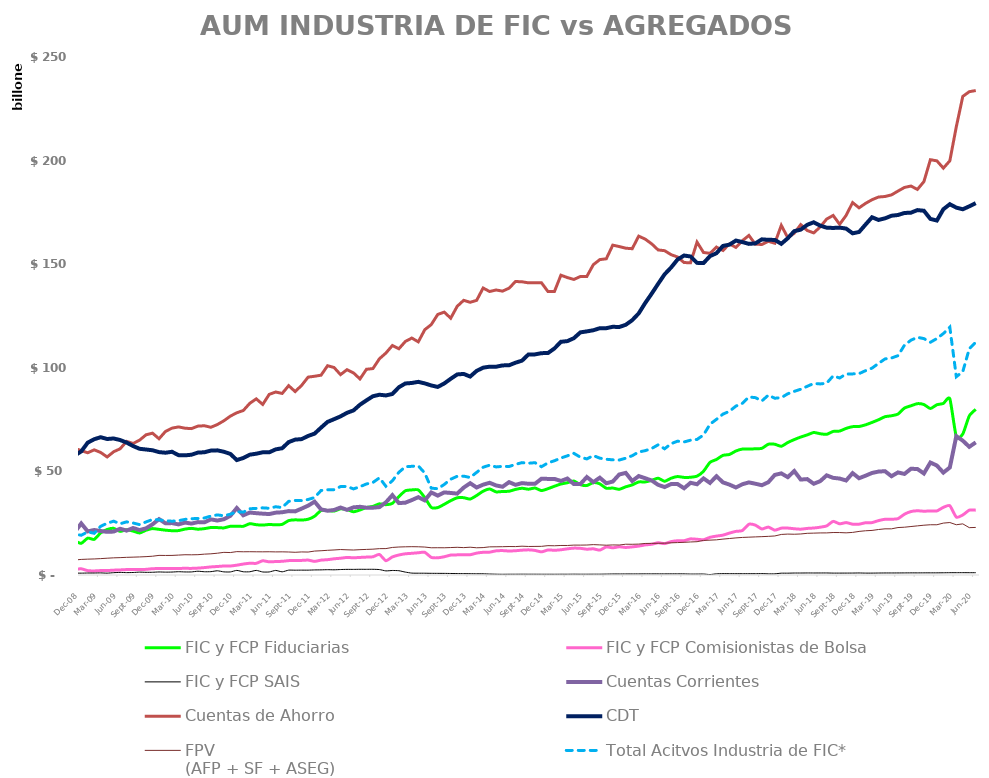
| Category | FIC y FCP Fiduciarias | FIC y FCP Comisionistas de Bolsa  | FIC y FCP SAIS | Cuentas Corrientes | Cuentas de Ahorro | CDT | FPV 
(AFP + SF + ASEG) | Total Acitvos Industria de FIC*  |
|---|---|---|---|---|---|---|---|---|
| 2008-01-01 | 12132808.79 | 2121832.26 | 544957.64 | 19249897.427 | 56056210.717 | 44941279.529 | 6945547.417 | 14799598.69 |
| 2008-02-01 | 12289879.65 | 2209666.7 | 519406.62 | 19213144.763 | 58419307.534 | 46482106.381 | 6986252.995 | 15018952.97 |
| 2008-03-01 | 12539377.12 | 2365642.48 | 580026.4 | 19370655.062 | 58209076.429 | 46770117.743 | 7003508.339 | 15485046 |
| 2008-04-01 | 12741364.47 | 2282972.94 | 561624.36 | 19492288.329 | 56874678.086 | 50148441.992 | 7150454.725 | 15585961.77 |
| 2008-05-01 | 12829643.03 | 2496281.61 | 662058.6 | 18663722.507 | 55639744.889 | 50761825.818 | 7208344.175 | 15987983.24 |
| 2008-06-01 | 12830951.12 | 2449742.03 | 701874.68 | 20003271.69 | 54847359.853 | 52034374.991 | 7166940.12 | 15982567.83 |
| 2008-07-01 | 13541278.95 | 2558464.4 | 754965.98 | 20342547.222 | 55678115.649 | 53125364.529 | 7175159.671 | 16854709.33 |
| 2008-08-01 | 13772968.36 | 2624403.07 | 815049.75 | 19770767.165 | 56148266.184 | 55348186.864 | 7294900.84 | 17212421.18 |
| 2008-09-01 | 13734669.578 | 2310280.49 | 544732.35 | 19250250.046 | 56145402.999 | 57015473.451 | 7349973.229 | 16589682.418 |
| 2008-10-01 | 13953414.868 | 2633334.91 | 921341.15 | 19804369.956 | 58986747.367 | 57700276.163 | 7188191.891 | 17508090.928 |
| 2008-11-01 | 16163521.832 | 2705717.241 | 932219.524 | 20735409.062 | 61155619.251 | 57692228.019 | 7246974.689 | 19801458.597 |
| 2008-12-01 | 15284899.058 | 2999156.471 | 891716.476 | 24887321.444 | 60019672.799 | 59648963.504 | 7516031.999 | 19175772.005 |
| 2009-01-01 | 17792239.172 | 2100542.66 | 962439.26 | 21040089.438 | 58999367.687 | 63877394.025 | 7647629.694 | 20855221.092 |
| 2009-02-01 | 17194217.152 | 1967140.68 | 956293.14 | 21714869.41 | 60405778.82 | 65534380.712 | 7751657.459 | 20117650.972 |
| 2009-03-01 | 20337363.88 | 2134644.38 | 1012448.54 | 21229406.812 | 59137277.4 | 66499801.412 | 7903642.968 | 23484456.8 |
| 2009-04-01 | 21958761.164 | 2138631.81 | 896627.12 | 20817553.96 | 56964966.372 | 65635299.329 | 8099376.93 | 24994020.094 |
| 2009-05-01 | 22513996.419 | 2336055.3 | 1121578.42 | 20961604.211 | 59492776.482 | 65895170.219 | 8286121.084 | 25971630.139 |
| 2009-06-01 | 21046486.068 | 2448437.58 | 1248642.13 | 22321940.134 | 60913043.271 | 65133059.461 | 8385600.015 | 24743565.778 |
| 2009-07-01 | 21871781.17 | 2623440.68 | 1149701.35 | 21420752.429 | 64486469.469 | 63910383.949 | 8522248.082 | 25644923.2 |
| 2009-08-01 | 21188789.878 | 2709594.68 | 1206713.71 | 22688223.969 | 63475807.938 | 62251898.303 | 8613906.771 | 25105098.268 |
| 2009-09-01 | 20280820.943 | 2658291.05 | 1386121.35 | 21673686.686 | 65073515.135 | 60908624.489 | 8719243.902 | 24325233.343 |
| 2009-10-01 | 21608487.093 | 2725247.27 | 1290257.29 | 22525547.45 | 67672284.07 | 60562742.887 | 8861759.81 | 25623991.653 |
| 2009-11-01 | 22396153.656 | 3044545.31 | 1317226.5 | 24455054.889 | 68440998.474 | 60197481.156 | 9068046.526 | 26757925.466 |
| 2009-12-01 | 22031134.901 | 3106700.35 | 1468565.02 | 26967356.932 | 65747994.242 | 59311640.164 | 9469304.205 | 26606400.271 |
| 2010-01-01 | 21639369.678 | 3179311.49 | 1383329.28 | 24954039.431 | 69305725.954 | 59022895.072 | 9433451.602 | 26202010.448 |
| 2010-02-01 | 21372785.209 | 3169119.85 | 1423495.84 | 25049574.137 | 70880759.204 | 59472247.066 | 9452309.941 | 25965400.899 |
| 2010-03-01 | 21434402.584 | 3174174.41 | 1594227.95 | 24420636.902 | 71469459.614 | 57851242.755 | 9611509.694 | 26202804.944 |
| 2010-04-01 | 22143243.751 | 3212727.75 | 1475837.14 | 25301982.328 | 70847211.96 | 57735039.025 | 9778654.214 | 26831808.641 |
| 2010-05-01 | 22503307.867 | 3190200.84 | 1483983.1 | 24812065.229 | 70645167.236 | 58048404.335 | 9744618.09 | 27177491.807 |
| 2010-06-01 | 22108087.545 | 3329038.91 | 1824933.45 | 25526414.201 | 71856536.453 | 59077438.758 | 9809143.264 | 27262059.905 |
| 2010-07-01 | 22375035.018 | 3572124.43 | 1568907.5 | 25422219.387 | 72032667.79 | 59235603.294 | 10060626.167 | 27516066.948 |
| 2010-08-01 | 22916586.47 | 3900515.32 | 1614182.63 | 26846242.145 | 71298447.382 | 60053578.291 | 10224850.699 | 28431284.42 |
| 2010-09-01 | 22872109.022 | 4099833.03 | 2037298.42 | 26290119.128 | 72611229.804 | 60156407.545 | 10513688.388 | 29009240.472 |
| 2010-10-01 | 22738234.3 | 4334389.78 | 1510252.83 | 26915819.282 | 74425012.581 | 59484867.202 | 10923089.827 | 28582876.91 |
| 2010-11-01 | 23509021.497 | 4340862.77 | 1483729.95 | 28542298.222 | 76665094.553 | 58441211.555 | 10834942.436 | 29333614.217 |
| 2010-12-01 | 23562424.684 | 4742999.64 | 2220193.91 | 32321078.595 | 78306142.612 | 55481322.699 | 11287314.204 | 30525618.234 |
| 2011-01-01 | 23495462.935 | 5289330.33 | 1556608.79 | 28820282.353 | 79376902.142 | 56468354.569 | 11207478.664 | 30341402.055 |
| 2011-02-01 | 24756664.566 | 5671618.52 | 1557593.58 | 30139906.351 | 82855125.664 | 58066057.51 | 11241368.84 | 31985876.666 |
| 2011-03-01 | 24274171.983 | 5632171 | 2217657.92 | 29838743.535 | 85010576 | 58536112.765 | 11202074.386 | 32124000.903 |
| 2011-04-01 | 24079345.463 | 6874755.37 | 1459776.52 | 29601505.07 | 82318818.989 | 59218987.736 | 11186753.753 | 32413877.353 |
| 2011-05-01 | 24377123.84 | 6341089.37 | 1476727.22 | 29409468.572 | 87172125.694 | 59206285.34 | 11220777.412 | 32194940.43 |
| 2011-06-01 | 24231078.42 | 6497028.02 | 2208092.5 | 30092330.237 | 88317380.74 | 60632244.817 | 11151147.79 | 32936198.94 |
| 2011-07-01 | 24434485.473 | 6608224.15 | 1531324.1 | 30282648.215 | 87627158.97 | 61184870.919 | 11176095.923 | 32574033.723 |
| 2011-08-01 | 26259447.52 | 6935490.17 | 2337915.55 | 30841103.551 | 91374682.8 | 64138804.274 | 11105936.296 | 35532853.24 |
| 2011-09-01 | 26623402.24 | 7041608 | 2322454.44 | 30699988.434 | 88529234.728 | 65335826.716 | 10964113.148 | 35987464.68 |
| 2011-10-01 | 26508006.996 | 7048002.36 | 2350293.45 | 32047983.66 | 91517505.226 | 65586962.022 | 11133132.15 | 35906302.806 |
| 2011-11-01 | 26909737.637 | 7192733.79 | 2342058.33 | 33456111.369 | 95502293.755 | 67109432.547 | 11074843.165 | 36444529.757 |
| 2011-12-01 | 28364982 | 6564786 | 2446719 | 35393548 | 95919744 | 68235861 | 11546595.74 | 37376487 |
| 2012-01-01 | 31131719 | 7180505 | 2478839 | 31668037.398 | 96429813.54 | 71134244.387 | 11708431.684 | 40791063 |
| 2012-02-01 | 31147275 | 7394169 | 2567975 | 31007469.335 | 101002712.63 | 73897067.082 | 11919293.346 | 41109419 |
| 2012-03-01 | 30833181 | 7823743 | 2510077 | 31372893 | 100150619 | 75192619 | 12082910.478 | 41167001 |
| 2012-04-01 | 31932047.65 | 8092229 | 2636558 | 32563742.234 | 96711407.203 | 76553414.137 | 12289106.986 | 42660834.65 |
| 2012-05-01 | 31562405.39 | 8467811 | 2716675 | 31445716.846 | 99087467.96 | 78272819.151 | 12156412.148 | 42746891.39 |
| 2012-06-01 | 30524721 | 8309508 | 2714337 | 32652205 | 97535090 | 79427656 | 12058126.88 | 41548566 |
| 2012-07-01 | 31384745 | 8476043 | 2753609 | 32914215.201 | 94633321.372 | 82178131.299 | 12231491.476 | 42614397 |
| 2012-08-01 | 32556264.125 | 8636341.39 | 2741827.01 | 32473082.673 | 99284188.863 | 84293159.574 | 12345156.611 | 43934432.525 |
| 2012-09-01 | 33120247 | 8786891 | 2754338 | 32485301.148 | 99622220.756 | 86273608.494 | 12470152.972 | 44661476 |
| 2012-10-01 | 34338711 | 9924835 | 2621952 | 32757672.42 | 104358590.858 | 87001274.106 | 12720740.166 | 46885498 |
| 2012-11-01 | 33938618 | 6897363 | 1988330 | 35055250.43 | 107111414.949 | 86660359.79 | 12745871.11 | 42824311 |
| 2012-12-01 | 34561616 | 8728627 | 2179791 | 38535455.952 | 110750588.805 | 87369641.716 | 13299299.104 | 45470034 |
| 2013-01-01 | 37836891 | 9651351 | 2068186 | 34709885.184 | 109182797.981 | 90615049.292 | 13509250.551 | 49556428 |
| 2013-02-01 | 40632956.33 | 10231474 | 1400201 | 34899680.619 | 112707815.094 | 92434040.154 | 13607848.915 | 52264631.33 |
| 2013-03-01 | 41069868 | 10463859 | 912927 | 36164862.111 | 114356257.363 | 92680012.269 | 13671877.605 | 52446654 |
| 2013-04-01 | 41043734 | 10736529 | 867910 | 37556322.05 | 112533114.733 | 93226256.238 | 13626257.475 | 52648173 |
| 2013-05-01 | 37372662.65 | 10950463 | 857331 | 36017787.759 | 118386119.194 | 92468633.061 | 13484574.137 | 49180456.65 |
| 2013-06-01 | 32613179 | 8493261 | 808179 | 39842306.408 | 120861072.922 | 91484124.39 | 13139969.891 | 41914619 |
| 2013-07-01 | 32539415 | 8294683 | 794522 | 38314923.667 | 125752507.028 | 90763716.528 | 13164680.049 | 41628620 |
| 2013-08-01 | 34114942.963 | 8807642.89 | 778363.4 | 39857916.017 | 126871339.693 | 92441495.764 | 13138412.03 | 43700949.253 |
| 2013-09-01 | 35884012 | 9612656 | 733729 | 39603634.773 | 123946270.663 | 94694686.716 | 13248237.194 | 46230397 |
| 2013-10-01 | 37250894 | 9715070 | 678939 | 39272659.973 | 129674911.513 | 96800721.471 | 13368711.223 | 47644903 |
| 2013-11-01 | 37318372.93 | 9735967.95 | 660905.93 | 42179693.943 | 132565745.258 | 97042379.372 | 13213562.109 | 47715246.81 |
| 2013-12-01 | 36647206.822 | 9781706.51 | 627244.94 | 44300089.672 | 131616929.6 | 95773066.764 | 13412280.346 | 47056158.272 |
| 2014-01-01 | 38369903.334 | 10557268.53 | 595392.99 | 42230304 | 132558811 | 98518081 | 13141330.376 | 49522564.854 |
| 2014-02-01 | 40449101.764 | 10954202.7 | 588536.56 | 43599724.41 | 138509031.454 | 100065132.396 | 13233550.635 | 51991841.024 |
| 2014-03-01 | 41519630.114 | 11027301.95 | 470068.23 | 44500844.044 | 136817273.962 | 100541868.899 | 13584518.658 | 53017000.294 |
| 2014-04-01 | 40116498 | 11657872 | 385729 | 43231698.1 | 137554847.305 | 100516933.788 | 13615476.315 | 52160099 |
| 2014-05-01 | 40315151.32 | 11776989.97 | 345001.78 | 42585585.256 | 137008074.28 | 101154120.942 | 13660673.832 | 52437143.07 |
| 2014-06-01 | 40416098.89 | 11579961.3 | 371228.88 | 44817124.428 | 138429028.965 | 101220614.506 | 13743144.418 | 52367289.07 |
| 2014-07-01 | 41316797 | 11715729 | 375325 | 43521000 | 141652000 | 102464000 | 13715305.865 | 53407851 |
| 2014-08-01 | 41855731.708 | 11985721.68 | 391319.12 | 44347000 | 141508000 | 103457000 | 13905242.744 | 54232772.508 |
| 2014-09-01 | 41411891.289 | 12137558.48 | 380927.6 | 44025212.782 | 141003775.677 | 106475441.817 | 13762483.464 | 53930377.369 |
| 2014-10-01 | 41975634 | 11856857 | 377516 | 44025212.782 | 141003775.677 | 106475441.817 | 13795830.272 | 54210007 |
| 2014-11-01 | 40740001.671 | 11158123 | 368897 | 46462368.859 | 141050657.705 | 107070411.692 | 13829598.92 | 52267021.671 |
| 2014-12-01 | 41656654.292 | 12075430.7 | 368901.58 | 46381000 | 136815000 | 107117082.017 | 14167694.014 | 54100986.572 |
| 2015-01-01 | 42829367 | 11943981 | 361106 | 46380640.852 | 136815012.002 | 109331074.058 | 14105770.897 | 55134454 |
| 2015-02-01 | 43906014 | 12174662 | 377946 | 45389931.566 | 144696890.023 | 112547249.862 | 14245271.387 | 56458622 |
| 2015-03-01 | 44527590 | 12624685 | 373755 | 46556394.03 | 143546680.679 | 112885686.92 | 14238413.855 | 57526030 |
| 2015-04-01 | 45347838 | 12968209 | 400026 | 43882131.877 | 142640978.203 | 114295912.468 | 14432998.432 | 58716073 |
| 2015-05-01 | 43602206.437 | 12870169 | 379934 | 43868330.885 | 144067660.411 | 117095747.48 | 14423377.487 | 56852309.437 |
| 2015-06-01 | 43184659.116 | 12456297 | 378882 | 47269216.705 | 144099449.315 | 117576199.725 | 14467508.121 | 56019838.116 |
| 2015-07-01 | 44614821.846 | 12629777 | 394228 | 44824893.119 | 149762182.064 | 118118438.808 | 14663702.588 | 57638826.846 |
| 2015-08-01 | 43989076.157 | 12009130 | 397232 | 46961211.638 | 152216129.231 | 119114602.082 | 14529265.46 | 56395438.157 |
| 2015-09-01 | 41857276.437 | 13554913 | 440374 | 44277600.072 | 152612486.174 | 119116749.002 | 14379522.061 | 55852563.437 |
| 2015-10-01 | 41966985 | 13118659.51 | 501533 | 45094005.049 | 159196192.021 | 119793024.514 | 14509464.447 | 55587177.51 |
| 2015-11-01 | 41365255 | 13619238 | 502481 | 48513369.195 | 158519924.955 | 119681100.359 | 14468322.769 | 55486974 |
| 2015-12-01 | 42558876.345 | 13300169 | 516569 | 49285505.594 | 157725448.27 | 120756047.93 | 14848609.659 | 56375614.345 |
| 2016-01-01 | 43472183 | 13579289 | 517684 | 45368735.999 | 157475605.492 | 122975254.619 | 14825068.35 | 57569156 |
| 2016-02-01 | 44904961.572 | 13948131 | 526504 | 47744020.678 | 163541609.018 | 126254546.723 | 14915465.741 | 59379596.572 |
| 2016-03-01 | 44921377.27 | 14526538 | 551021 | 46707243.646 | 162117145.793 | 131244339.223 | 15223556.252 | 59998936.27 |
| 2016-04-01 | 45667420 | 14828090 | 550022 | 45621999.683 | 159833273.331 | 135771123.5 | 15263360.655 | 61045532 |
| 2016-05-01 | 46726726.617 | 15560816 | 551107 | 43514447.944 | 156878031.239 | 140527045.012 | 15313185.27 | 62838649.617 |
| 2016-06-01 | 45222447.609 | 15141673 | 547564 | 42434113.352 | 156521975.202 | 145130344.445 | 15357677.844 | 60911684.609 |
| 2016-07-01 | 46710606.529 | 16108722 | 553440 | 43891948.187 | 154596652.035 | 148404415.743 | 15528129.989 | 63372768.529 |
| 2016-08-01 | 47512415 | 16527322 | 562941 | 43890420.74 | 153476072.003 | 152277396.699 | 15646521.009 | 64602678 |
| 2016-09-01 | 47102022.877 | 16559309 | 549077 | 41863341.532 | 150778144.586 | 154187082.647 | 15773427.906 | 64210408.877 |
| 2016-10-01 | 47168514.542 | 17435641 | 460432 | 44505224.349 | 150721044.65 | 153731885.974 | 15947295.967 | 65064587.542 |
| 2016-11-01 | 47718064 | 17243897 | 464614 | 43803723.471 | 160646159.221 | 150647315.539 | 16070122.225 | 65426575 |
| 2016-12-01 | 50077108.765 | 17024827 | 481553 | 46616292.021 | 155649773.745 | 150549237.17 | 16686648.639 | 67583488.765 |
| 2017-01-01 | 54368178.505 | 18181608 | 222152 | 44442010.194 | 155244726.496 | 153886811.688 | 16818695.993 | 72771938.505 |
| 2017-02-01 | 55762190.181 | 18776174.177 | 579714.85 | 47657415.777 | 158251548.569 | 155310289.15 | 16972857.277 | 75118079.208 |
| 2017-03-01 | 57747289.049 | 19241862.357 | 655367.902 | 44697365.002 | 156647290.937 | 158821173.031 | 17322864.933 | 77644519.308 |
| 2017-04-01 | 58164520 | 20227683 | 641508 | 43616908.455 | 159780567.33 | 159434119.369 | 17610744.228 | 79033711 |
| 2017-05-01 | 59841564 | 21050779 | 628347 | 42239864.757 | 158115214.364 | 161414965.04 | 17897354.211 | 81520690 |
| 2017-06-01 | 60786454.012 | 21451129.062 | 628314.626 | 43810127.154 | 161349013.039 | 160671195.131 | 18136078.113 | 82865897.7 |
| 2017-07-01 | 60816180.783 | 24476364.089 | 632988.556 | 44691718.554 | 163885549.644 | 159803990.507 | 18261453.112 | 85925533.428 |
| 2017-08-01 | 60902525 | 24058592 | 631625 | 44054660.814 | 159638000 | 160059000 | 18386706.881 | 85592742 |
| 2017-09-01 | 61127629 | 22219060 | 673578 | 43330054.008 | 159527528.2 | 161996651.348 | 18508890.927 | 84020267 |
| 2017-10-01 | 63105115.683 | 23122990 | 561905 | 44789028.673 | 161040018.386 | 161758053.274 | 18651311.322 | 86790010.683 |
| 2017-11-01 | 63102535 | 21640090 | 566184 | 48308003.562 | 160113329.651 | 161726673.163 | 18839024.719 | 85308809 |
| 2017-12-01 | 62127325 | 22603730 | 875331 | 49040782.522 | 168742902.483 | 159841329.569 | 19576385.715 | 85606386 |
| 2018-01-01 | 63938242 | 22648623 | 879678 | 47216931.732 | 162781465.049 | 162535157.785 | 19748025.204 | 87466543 |
| 2018-02-01 | 65357837 | 22320847 | 950750 | 50174200.241 | 164930800.368 | 165943798.481 | 19669969.384 | 88629434 |
| 2018-03-01 | 66580958 | 22111577 | 954371 | 46064458.079 | 169103161.446 | 166672653.203 | 19802479.283 | 89646906 |
| 2018-04-01 | 67605714 | 22478848 | 983710 | 46287698.831 | 166258678.919 | 169010131.166 | 20119796.013 | 91068272 |
| 2018-05-01 | 68783686 | 22674488 | 970461 | 44034361.721 | 165106317.223 | 170232145.256 | 20203862.672 | 92428635 |
| 2018-06-01 | 68179383 | 23064433 | 977571 | 45282598.338 | 167988914.573 | 168605713.635 | 20307291.936 | 92221387 |
| 2018-07-01 | 67891332.876 | 23695065 | 981550 | 48090725.791 | 171789954.916 | 167623407.946 | 20321726.758 | 92567947.876 |
| 2018-08-01 | 69290394.916 | 25889867 | 916282 | 46892865.731 | 173528210.847 | 167494515.744 | 20496962.068 | 96096543.916 |
| 2018-09-01 | 69468408 | 24695139 | 918203 | 46545235.243 | 169253761.111 | 167650153.722 | 20484787.245 | 95081750 |
| 2018-10-01 | 70752372.545 | 25303024 | 923856 | 45619808.862 | 173540048.109 | 167193109.497 | 20349410.39 | 96979252.545 |
| 2018-11-01 | 71596777 | 24525057 | 936854 | 49168133.858 | 179733646.903 | 164906615.194 | 20551807.323 | 97058688 |
| 2018-12-01 | 71679839 | 24525616 | 982589 | 46701780.579 | 177202446.744 | 165546553.572 | 21038534.051 | 97188044 |
| 2019-01-01 | 72479982 | 25224946 | 913635 | 47919007.538 | 179357673.563 | 169137227.662 | 21352471.029 | 98618563 |
| 2019-02-01 | 73642869 | 25291314 | 915329 | 49251446.721 | 181126226.127 | 172655618.131 | 21509245.731 | 99849512 |
| 2019-03-01 | 74925058 | 26249781 | 953344 | 49915673.748 | 182418243.406 | 171353531.629 | 21952152 | 102128183 |
| 2019-04-01 | 76387191 | 26901659 | 984140 | 50098154.109 | 182670636.205 | 172132365.456 | 22277971 | 104272990 |
| 2019-05-01 | 76851157.52 | 26901659 | 984140 | 47668839.935 | 183449047.246 | 173388676.147 | 22277971 | 104736956.52 |
| 2019-06-01 | 77670420 | 27188020 | 990243 | 49503365.541 | 185288152.785 | 173744511.023 | 22897709 | 105848683 |
| 2019-07-01 | 80565138.336 | 29333372 | 1008806 | 48777078.865 | 187040794.645 | 174724088.504 | 23064609 | 110907316.336 |
| 2019-08-01 | 81665926 | 30619880 | 1026967 | 51259181.407 | 187718162.039 | 174863760.82 | 23392445 | 113312773 |
| 2019-09-01 | 82690421 | 31003788 | 1024257 | 51167798.313 | 186094828.693 | 176108385.563 | 23715691 | 114718466 |
| 2019-10-01 | 82266738 | 30781025 | 1039920 | 48995503.076 | 189857556.141 | 175798830.418 | 24030558 | 114087683 |
| 2019-11-01 | 80353973 | 30911689 | 1047092 | 54284893.549 | 200422018.163 | 171857691.006 | 24244735 | 112312754 |
| 2019-12-01 | 82151903.071 | 30911689 | 1047092 | 52830252.44 | 199894729.527 | 171064162.485 | 24244735 | 114110684.071 |
| 2020-01-01 | 82805198 | 32656201 | 1074419 | 49409711.466 | 196356438.807 | 176524939.06 | 25050286 | 116535818 |
| 2020-02-01 | 85032535 | 33436183 | 1114435 | 51895139.317 | 199894729.527 | 178952079.989 | 25329244 | 119583153 |
| 2020-03-01 | 66653380 | 27922541 | 1119686 | 66994716.314 | 216350021.864 | 177306532.246 | 24258651 | 95695607 |
| 2020-04-01 | 68067849 | 28967912 | 1128656 | 64826202.461 | 230976315.947 | 176509180.865 | 24675238 | 98164417 |
| 2020-05-01 | 76776524 | 31299813 | 1114186 | 61861996.807 | 233257059.364 | 177928893.453 | 22851890 | 109190523 |
| 2020-06-01 | 79968756.495 | 31299813 | 1114186 | 64007790.448 | 233812487.66 | 179459613.807 | 22959453 | 112382755.495 |